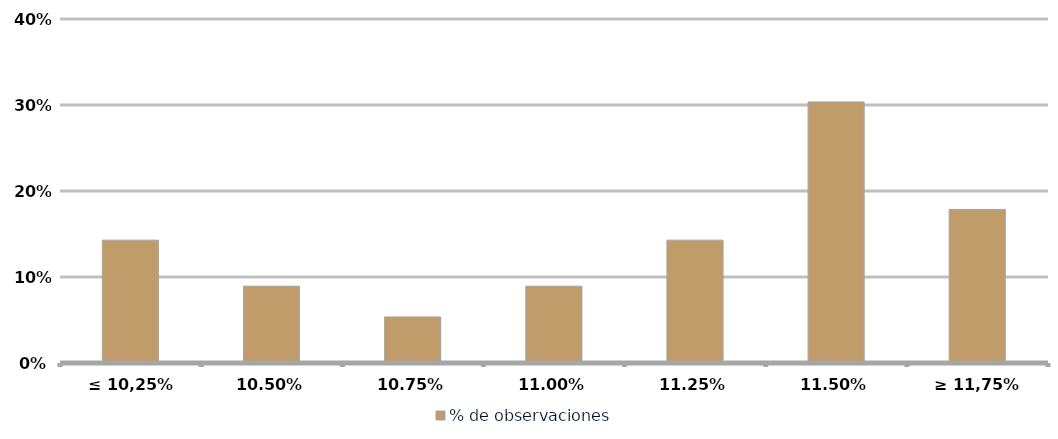
| Category | % de observaciones  |
|---|---|
| ≤ 10,25% | 0.143 |
| 10,50% | 0.089 |
| 10,75% | 0.054 |
| 11,00% | 0.089 |
| 11,25% | 0.143 |
| 11,50% | 0.304 |
| ≥ 11,75% | 0.179 |